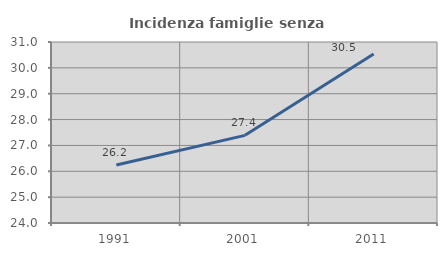
| Category | Incidenza famiglie senza nuclei |
|---|---|
| 1991.0 | 26.24 |
| 2001.0 | 27.39 |
| 2011.0 | 30.534 |